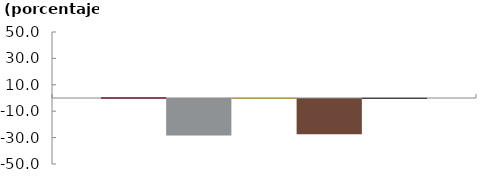
| Category | Bancos | CF | CFC | Coop | Sistema |
|---|---|---|---|---|---|
|  | 0.828 | -27.704 | 0.263 | -26.761 | 0.16 |